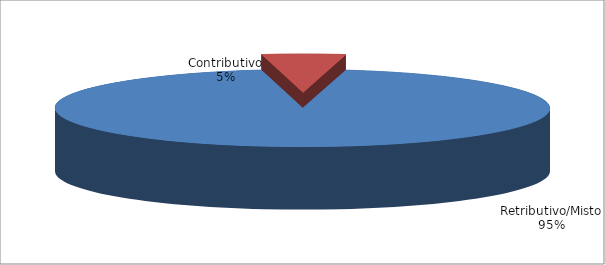
| Category | Series 1 |
|---|---|
| Retributivo/Misto | 52549 |
| Contributivo | 3031 |